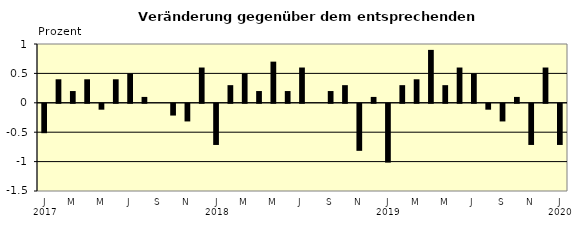
| Category | Series 0 |
|---|---|
| 0 | -0.5 |
| 1 | 0.4 |
| 2 | 0.2 |
| 3 | 0.4 |
| 4 | -0.1 |
| 5 | 0.4 |
| 6 | 0.5 |
| 7 | 0.1 |
| 8 | 0 |
| 9 | -0.2 |
| 10 | -0.3 |
| 11 | 0.6 |
| 12 | -0.7 |
| 13 | 0.3 |
| 14 | 0.5 |
| 15 | 0.2 |
| 16 | 0.7 |
| 17 | 0.2 |
| 18 | 0.6 |
| 19 | 0 |
| 20 | 0.2 |
| 21 | 0.3 |
| 22 | -0.8 |
| 23 | 0.1 |
| 24 | -1 |
| 25 | 0.3 |
| 26 | 0.4 |
| 27 | 0.9 |
| 28 | 0.3 |
| 29 | 0.6 |
| 30 | 0.5 |
| 31 | -0.1 |
| 32 | -0.3 |
| 33 | 0.1 |
| 34 | -0.7 |
| 35 | 0.6 |
| 36 | -0.7 |